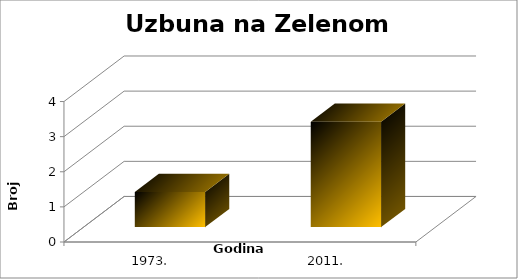
| Category | Broj Primjeraka |
|---|---|
| 1973. | 1 |
| 2011. | 3 |